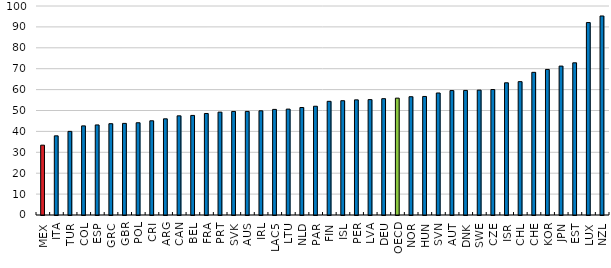
| Category | Series 0 |
|---|---|
| MEX | 33.413 |
| ITA | 37.876 |
| TUR | 40.007 |
| COL | 42.638 |
| ESP | 43.088 |
| GRC | 43.688 |
| GBR | 43.838 |
| POL | 44.139 |
| CRI | 45.076 |
| ARG | 46.019 |
| CAN | 47.45 |
| BEL | 47.639 |
| FRA | 48.566 |
| PRT | 49.215 |
| SVK | 49.547 |
| AUS | 49.568 |
| IRL | 49.853 |
| LAC5 | 50.525 |
| LTU | 50.663 |
| NLD | 51.43 |
| PAR | 52.037 |
| FIN | 54.389 |
| ISL | 54.682 |
| PER | 55.09 |
| LVA | 55.205 |
| DEU | 55.657 |
| OECD | 55.91 |
| NOR | 56.592 |
| HUN | 56.718 |
| SVN | 58.375 |
| AUT | 59.535 |
| DNK | 59.606 |
| SWE | 59.751 |
| CZE | 60.03 |
| ISR | 63.254 |
| CHL | 63.803 |
| CHE | 68.258 |
| KOR | 69.645 |
| JPN | 71.251 |
| EST | 72.815 |
| LUX | 92.072 |
| NZL | 95.224 |